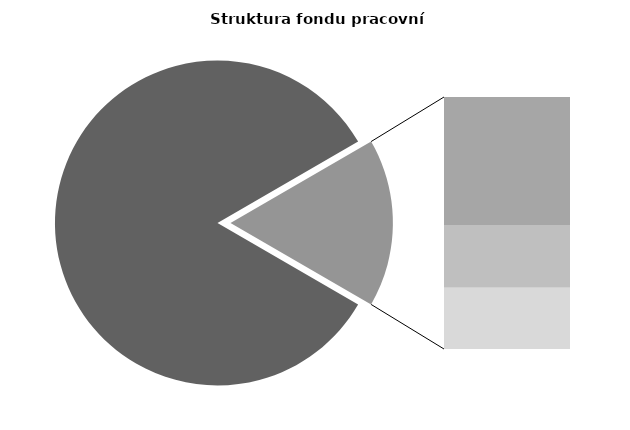
| Category | Series 0 |
|---|---|
| Průměrná měsíční odpracovaná doba bez přesčasu | 140.754 |
| Dovolená | 14.354 |
| Nemoc | 7.031 |
| Jiné | 6.852 |